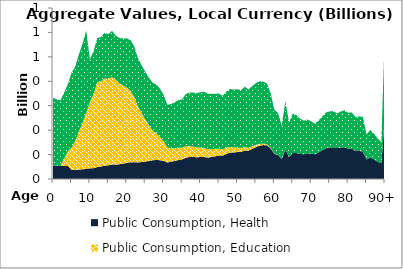
| Category | Public Consumption, Health | Public Consumption, Education | Public Consumption, Other than health and education |
|---|---|---|---|
| 0 | 54.789 | 0 | 276.624 |
|  | 54.008 | 0 | 272.701 |
| 2 | 53.123 | 0 | 268.159 |
| 3 | 53.631 | 29.086 | 270.72 |
| 4 | 54.276 | 58.863 | 273.899 |
| 5 | 37.599 | 89.568 | 307.521 |
| 6 | 37.187 | 118.118 | 304.111 |
| 7 | 38.76 | 153.92 | 316.979 |
| 8 | 39.681 | 189.04 | 324.344 |
| 9 | 41.269 | 229.403 | 337.295 |
| 10 | 43.597 | 270.572 | 176.062 |
| 11 | 44.472 | 303.498 | 175.472 |
| 12 | 48.915 | 347.448 | 180.71 |
| 13 | 51.191 | 348.331 | 181.421 |
| 14 | 54.673 | 357.532 | 186.463 |
| 15 | 55.994 | 352.915 | 184.292 |
| 16 | 59.045 | 359.574 | 188.003 |
| 17 | 58.83 | 346.948 | 181.619 |
| 18 | 60.4 | 330.999 | 185.632 |
| 19 | 63.025 | 319.671 | 192.848 |
| 20 | 66.03 | 308.57 | 201.171 |
| 21 | 68.37 | 292.829 | 207.416 |
| 22 | 68.592 | 267.601 | 207.225 |
| 23 | 67.934 | 230.102 | 198.26 |
| 24 | 69.314 | 200.999 | 195.544 |
| 25 | 71.306 | 173.79 | 194.576 |
| 26 | 73.596 | 147.016 | 194.364 |
| 27 | 76.732 | 121.177 | 196.234 |
| 28 | 77.951 | 110.054 | 199.544 |
| 29 | 76.903 | 95.861 | 197.048 |
| 30 | 73.943 | 80.097 | 189.64 |
| 31 | 67.765 | 62.474 | 173.955 |
| 32 | 70.797 | 53.99 | 181.904 |
| 33 | 74.019 | 52.333 | 188.037 |
| 34 | 77.454 | 50.529 | 194.555 |
| 35 | 79.893 | 47.827 | 198.444 |
| 36 | 86.907 | 47.434 | 213.472 |
| 37 | 90.394 | 44.638 | 219.586 |
| 38 | 89.938 | 42.623 | 221.25 |
| 39 | 89.13 | 40.418 | 222.084 |
| 40 | 89.877 | 38.869 | 226.868 |
| 41 | 89.946 | 36.956 | 230.052 |
| 42 | 87.601 | 34.048 | 227.066 |
| 43 | 90.273 | 32.165 | 226.363 |
| 44 | 93.029 | 30.323 | 225.899 |
| 45 | 95.775 | 28.487 | 225.437 |
| 46 | 95.796 | 25.922 | 218.771 |
| 47 | 103.267 | 25.329 | 229.007 |
| 48 | 107.844 | 23.656 | 236.91 |
| 49 | 108.616 | 21.086 | 236.404 |
| 50 | 110.483 | 18.737 | 238.29 |
| 51 | 110.958 | 16.166 | 237.183 |
| 52 | 116.594 | 14.275 | 247.052 |
| 53 | 115.94 | 12.151 | 238.241 |
| 54 | 123.352 | 10.861 | 245.962 |
| 55 | 130.494 | 9.408 | 252.64 |
| 56 | 136.184 | 7.748 | 256.134 |
| 57 | 138.878 | 5.886 | 253.881 |
| 58 | 137.979 | 4.589 | 248.364 |
| 59 | 125.397 | 3.069 | 222.33 |
| 60 | 102.691 | 1.644 | 179.4 |
| 61 | 99.036 | 0.779 | 170.533 |
| 62 | 80.891 | 0 | 137.334 |
| 63 | 121.103 | 0 | 197.631 |
| 64 | 89.32 | 0 | 140.296 |
| 65 | 106.84 | 0 | 161.719 |
| 66 | 106.285 | 0 | 155.211 |
| 67 | 102.375 | 0 | 144.388 |
| 68 | 101.233 | 0 | 137.686 |
| 69 | 105.288 | 0 | 138.382 |
| 70 | 103.892 | 0 | 132.2 |
| 71 | 101.023 | 0 | 124.67 |
| 72 | 109.005 | 0 | 130.665 |
| 73 | 117.708 | 0 | 138.786 |
| 74 | 125.924 | 0 | 146.321 |
| 75 | 128.818 | 0 | 147.753 |
| 76 | 130.522 | 0 | 147.975 |
| 77 | 126.427 | 0 | 141.839 |
| 78 | 128.779 | 0 | 147.376 |
| 79 | 130.027 | 0 | 151.381 |
| 80 | 124.484 | 0 | 147.115 |
| 81 | 124.012 | 0 | 148.502 |
| 82 | 114.746 | 0 | 139.023 |
| 83 | 114.744 | 0 | 141.953 |
| 84 | 112.556 | 0 | 141.712 |
| 85 | 79.79 | 0 | 101.974 |
| 86 | 87.713 | 0 | 113.557 |
| 87 | 80.676 | 0 | 105.629 |
| 88 | 70.916 | 0 | 94.672 |
| 89 | 64.605 | 0 | 87.702 |
| 90+ | 258.855 | 0 | 360.574 |